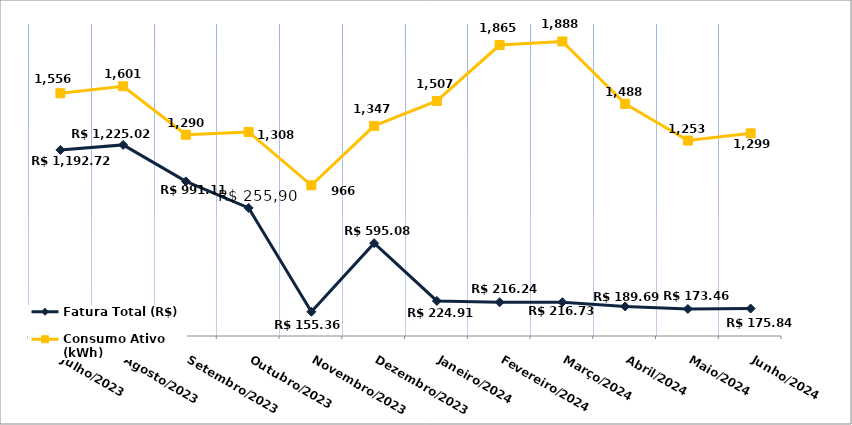
| Category | Fatura Total (R$) |
|---|---|
| Julho/2023 | 1192.72 |
| Agosto/2023 | 1225.02 |
| Setembro/2023 | 991.11 |
| Outubro/2023 | 821.03 |
| Novembro/2023 | 155.36 |
| Dezembro/2023 | 595.08 |
| Janeiro/2024 | 224.91 |
| Fevereiro/2024 | 216.24 |
| Março/2024 | 216.73 |
| Abril/2024 | 189.69 |
| Maio/2024 | 173.46 |
| Junho/2024 | 175.84 |